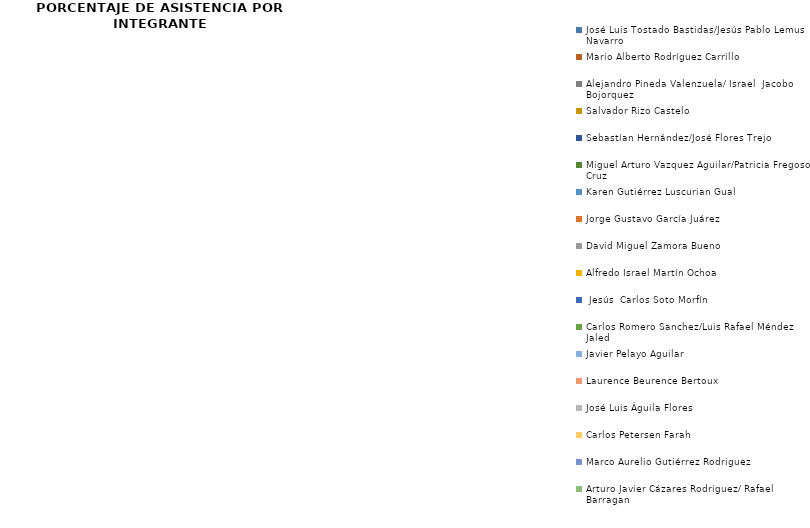
| Category | Series 0 |
|---|---|
| José Luis Tostado Bastidas/Jesús Pablo Lemus Navarro | 0 |
| Mario Alberto Rodríguez Carrillo | 0 |
| Alejandro Pineda Valenzuela/ Israel  Jacobo Bojorquez | 0 |
| Salvador Rizo Castelo | 0 |
| Sebastían Hernández/José Flores Trejo | 0 |
| Miguel Arturo Vazquez Aguilar/Patricia Fregoso Cruz | 0 |
| Karen Gutiérrez Luscurian Gual | 0 |
| Jorge Gustavo García Juárez | 0 |
| David Miguel Zamora Bueno | 0 |
| Alfredo Israel Martín Ochoa | 0 |
|  Jesús  Carlos Soto Morfín | 0 |
| Carlos Romero Sanchez/Luis Rafael Méndez Jaled | 0 |
| Javier Pelayo Aguilar | 0 |
| Laurence Beurence Bertoux | 0 |
| José Luis Águila Flores | 0 |
| Carlos Petersen Farah | 0 |
| Marco Aurelio Gutiérrez Rodriguez | 0 |
| Arturo Javier Cázares Rodriguez/ Rafael Barragan  | 0 |